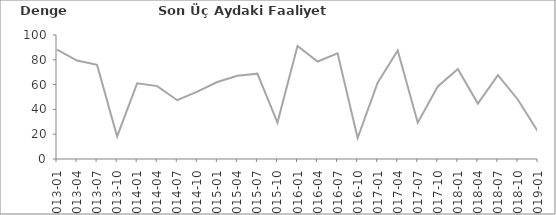
| Category | Son Üç Aydaki Faaliyet Gelirleri |
|---|---|
| 2013-01 | 88.2 |
| 2013-04 | 79.4 |
| 2013-07 | 75.9 |
| 2013-10 | 18.2 |
| 2014-01 | 61.1 |
| 2014-04 | 58.8 |
| 2014-07 | 47.4 |
| 2014-10 | 54.3 |
| 2015-01 | 62.1 |
| 2015-04 | 67.2 |
| 2015-07 | 68.8 |
| 2015-10 | 29.4 |
| 2016-01 | 91.1 |
| 2016-04 | 78.6 |
| 2016-07 | 85.2 |
| 2016-10 | 16.9 |
| 2017-01 | 61.5 |
| 2017-04 | 87.6 |
| 2017-07 | 29.3 |
| 2017-10 | 58.5 |
| 2018-01 | 72.6 |
| 2018-04 | 44.7 |
| 2018-07 | 67.6 |
| 2018-10 | 47.8 |
| 2019-01 | 22.1 |